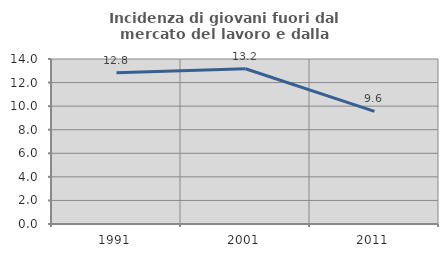
| Category | Incidenza di giovani fuori dal mercato del lavoro e dalla formazione  |
|---|---|
| 1991.0 | 12.838 |
| 2001.0 | 13.176 |
| 2011.0 | 9.557 |